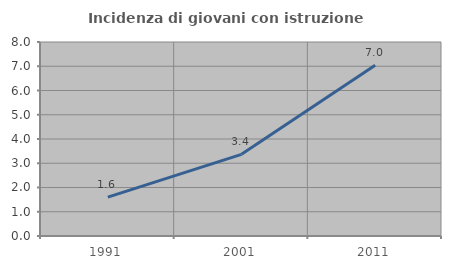
| Category | Incidenza di giovani con istruzione universitaria |
|---|---|
| 1991.0 | 1.602 |
| 2001.0 | 3.369 |
| 2011.0 | 7.039 |